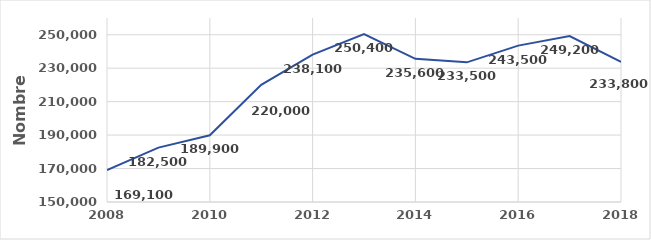
| Category | Series 0 |
|---|---|
| 2008.0 | 169100 |
| 2009.0 | 182500 |
| 2010.0 | 189900 |
| 2011.0 | 220000 |
| 2012.0 | 238100 |
| 2013.0 | 250400 |
| 2014.0 | 235600 |
| 2015.0 | 233500 |
| 2016.0 | 243500 |
| 2017.0 | 249200 |
| 2018.0 | 233800 |